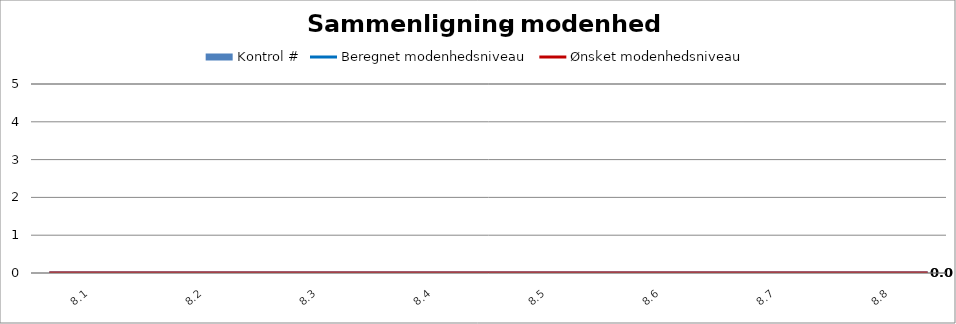
| Category | Kontrol # |
|---|---|
| 8.1 | 0 |
| 8.2 | 0 |
| 8.3 | 0 |
| 8.4 | 0 |
| 8.5 | 0 |
| 8.6 | 0 |
| 8.7 | 0 |
| 8.8 | 0 |